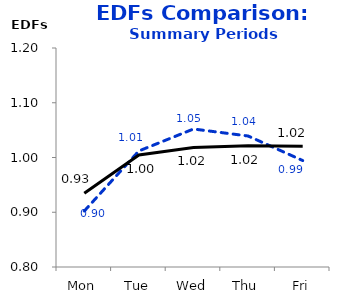
| Category | 1991-05 | 2006-Pres |
|---|---|---|
| Mon | 0.902 | 0.935 |
| Tue | 1.012 | 1.005 |
| Wed | 1.052 | 1.018 |
| Thu | 1.039 | 1.022 |
| Fri | 0.994 | 1.021 |